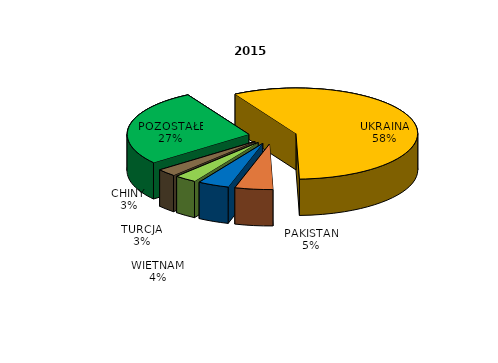
| Category | Series 0 |
|---|---|
| UKRAINA | 2365 |
| PAKISTAN | 206 |
| WIETNAM | 170 |
| TURCJA | 119 |
| CHINY | 108 |
| POZOSTAŁE | 1118 |